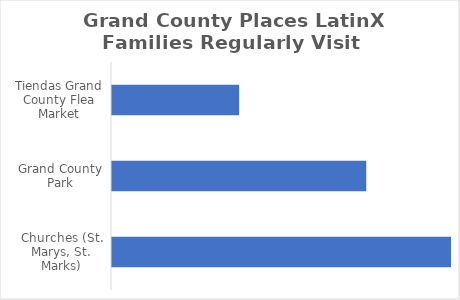
| Category | Grand County Places LatinX Families Regularly Visit (Rank order) |
|---|---|
| Churches (St. Marys, St. Marks) | 4 |
| Grand County Park | 3 |
| Tiendas Grand County Flea Market | 1.5 |